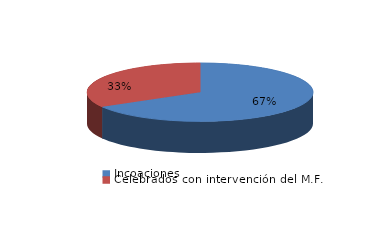
| Category | Series 0 |
|---|---|
| Incoaciones | 11786 |
| Celebrados con intervención del M.F. | 5912 |